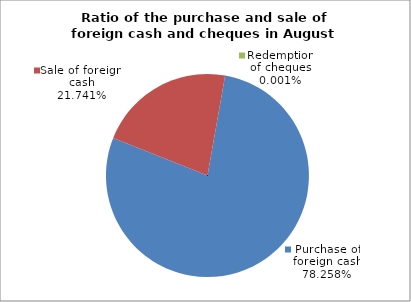
| Category | Purchase of foreign cash |
|---|---|
| 0 | 0.783 |
| 1 | 0.217 |
| 2 | 0 |